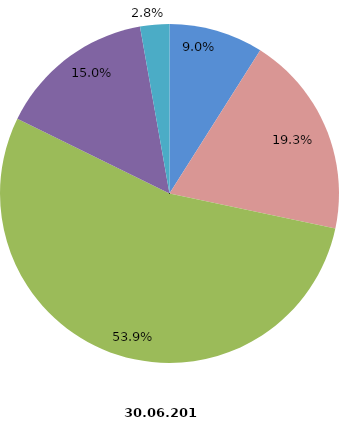
| Category | Beschäftigte 2016 |
|---|---|
| tätige Inhaber und Mitinhaber sowie unbezahlt mithelfende Familienangehörige | 2410 |
| kaufmännische und technische Arbeitnehmer | 5180 |
| Facharbeiter | 14459 |
| Fachwerker und Werker | 4007 |
| gewerblich Auszubildende, Umschüler, Praktikanten | 747 |